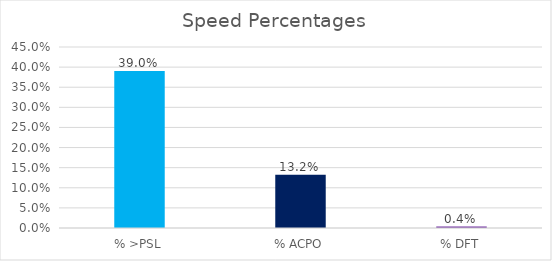
| Category | Series 0 |
|---|---|
| % >PSL | 0.39 |
| % ACPO | 0.132 |
| % DFT | 0.004 |